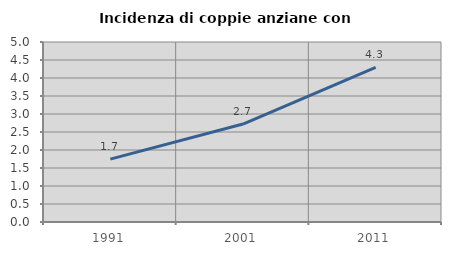
| Category | Incidenza di coppie anziane con figli |
|---|---|
| 1991.0 | 1.746 |
| 2001.0 | 2.721 |
| 2011.0 | 4.296 |